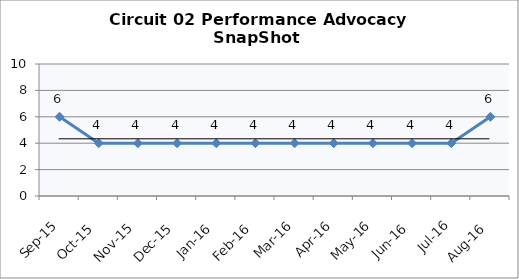
| Category | Circuit 02 |
|---|---|
| Sep-15 | 6 |
| Oct-15 | 4 |
| Nov-15 | 4 |
| Dec-15 | 4 |
| Jan-16 | 4 |
| Feb-16 | 4 |
| Mar-16 | 4 |
| Apr-16 | 4 |
| May-16 | 4 |
| Jun-16 | 4 |
| Jul-16 | 4 |
| Aug-16 | 6 |